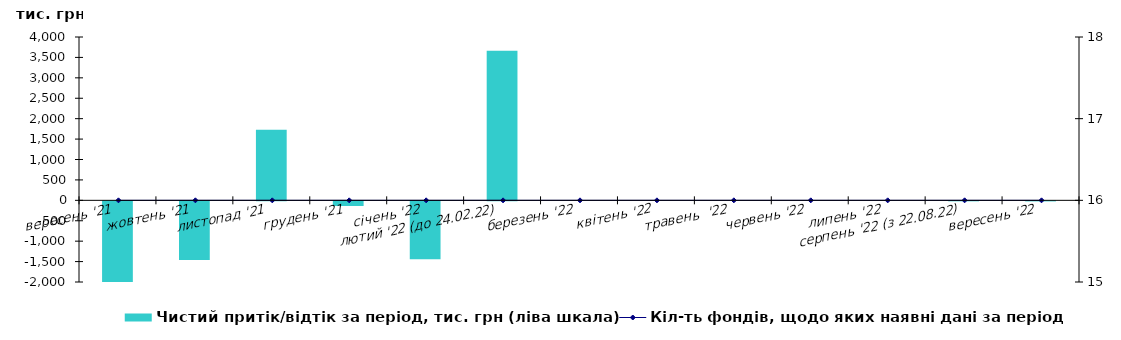
| Category | Чистий притік/відтік за період, тис. грн (ліва шкала) |
|---|---|
| вересень '21 | -4323.731 |
| жовтень '21 | -1437.042 |
| листопад '21 | 1726.823 |
| грудень '21 | -114.553 |
| січень '22 | -1419.798 |
| лютий '22 (до 24.02.22) | 3660.614 |
| березень '22 | 0 |
| квітень '22 | 0 |
| травень  '22 | 0 |
| червень '22 | 0 |
| липень '22 | 0 |
| серпень '22 (з 22.08.22) | -0.145 |
| вересень '22 | -2.047 |